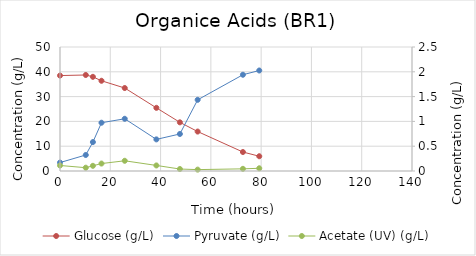
| Category | Glucose (g/L) |
|---|---|
| 0.0 | 38.481 |
| 10.250000000058208 | 38.713 |
| 13.083333333372138 | 37.972 |
| 16.5 | 36.385 |
| 25.749999999941792 | 33.457 |
| 38.33333333325572 | 25.468 |
| 47.683333333348855 | 19.625 |
| 54.75 | 15.904 |
| 72.75 | 7.652 |
| 79.25000000005821 | 5.95 |